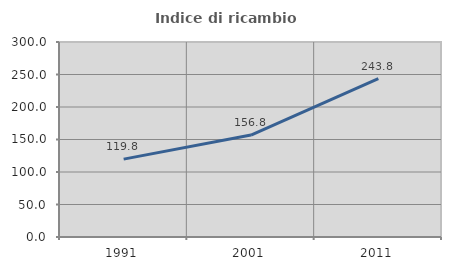
| Category | Indice di ricambio occupazionale  |
|---|---|
| 1991.0 | 119.784 |
| 2001.0 | 156.796 |
| 2011.0 | 243.827 |